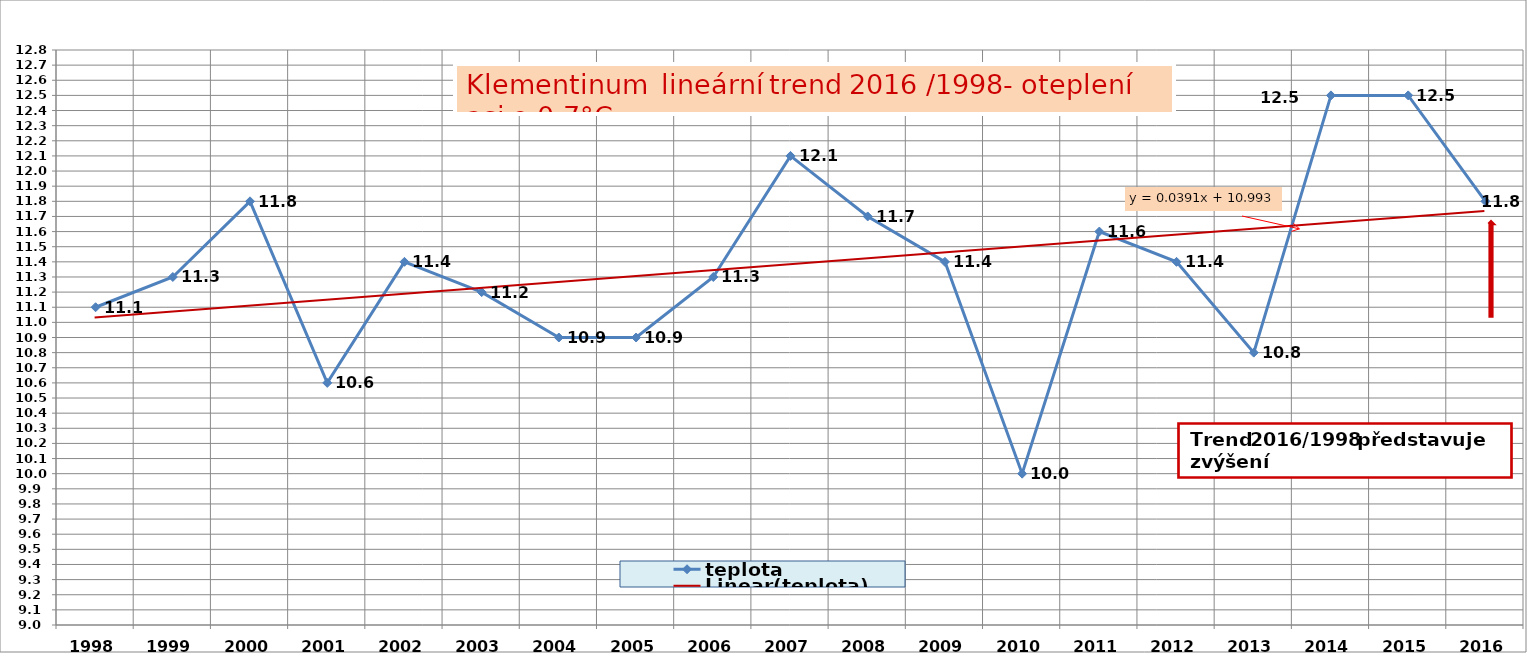
| Category | teplota |
|---|---|
| 1998 | 11.1 |
| 1999 | 11.3 |
| 2000 | 11.8 |
| 2001 | 10.6 |
| 2002 | 11.4 |
| 2003 | 11.2 |
| 2004 | 10.9 |
| 2005 | 10.9 |
| 2006 | 11.3 |
| 2007 | 12.1 |
| 2008 | 11.7 |
| 2009 | 11.4 |
| 2010 | 10 |
| 2011 | 11.6 |
| 2012 | 11.4 |
| 2013 | 10.8 |
| 2014 | 12.5 |
| 2015 | 12.5 |
| 2016 | 11.8 |